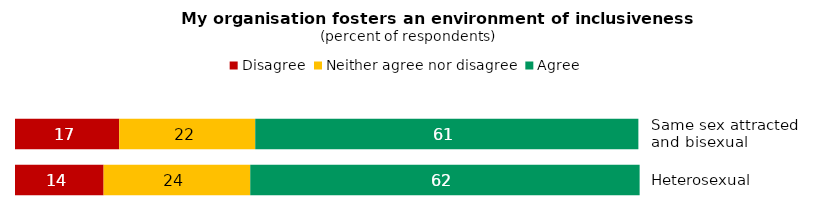
| Category | Disagree | Neither agree nor disagree | Agree |
|---|---|---|---|
| Same sex attracted 
and bisexual | 16.7 | 21.8 | 61.4 |
| Heterosexual | 14.2 | 23.5 | 62.4 |